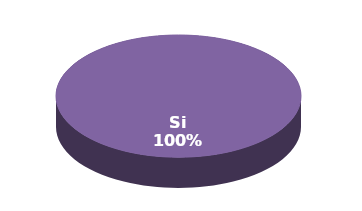
| Category | Series 1 |
|---|---|
| Si | 9 |